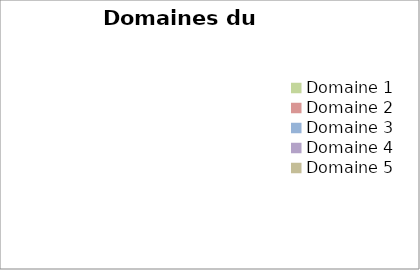
| Category | Series 0 |
|---|---|
| Domaine 1 | 0 |
| Domaine 2 | 0 |
| Domaine 3 | 0 |
| Domaine 4 | 0 |
| Domaine 5 | 0 |